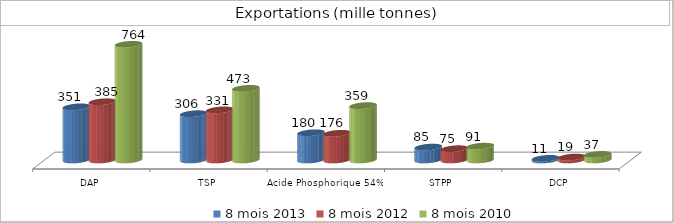
| Category | 8 mois 2013 | 8 mois 2012 | 8 mois 2010 |
|---|---|---|---|
| DAP | 351.073 | 384.778 | 764.155 |
| TSP | 305.74 | 330.995 | 473.189 |
| Acide Phosphorique 54% | 179.828 | 176.268 | 358.999 |
| STPP | 85.285 | 74.521 | 91.258 |
| DCP | 10.8 | 19.3 | 36.94 |